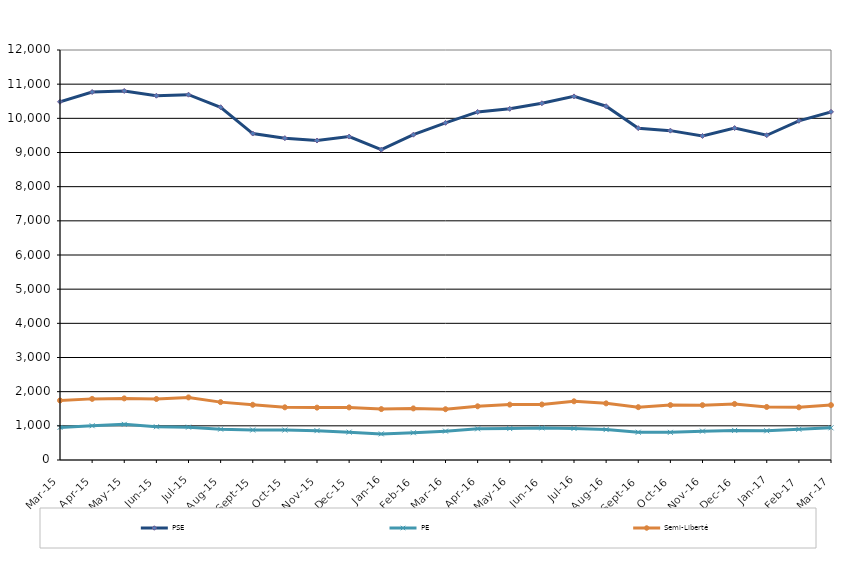
| Category | PSE | PE | Semi-Liberté |
|---|---|---|---|
| 2015-03-01 | 10485 | 954 | 1742 |
| 2015-04-01 | 10770 | 1003 | 1789 |
| 2015-05-01 | 10801 | 1043 | 1803 |
| 2015-06-01 | 10662 | 973 | 1785 |
| 2015-07-01 | 10692 | 961 | 1832 |
| 2015-08-01 | 10325 | 903 | 1694 |
| 2015-09-01 | 9555 | 878 | 1616 |
| 2015-10-01 | 9420 | 877 | 1542 |
| 2015-11-01 | 9350 | 859 | 1533 |
| 2015-12-01 | 9466 | 815 | 1539 |
| 2016-01-01 | 9081 | 764 | 1490 |
| 2016-02-01 | 9521 | 798 | 1510 |
| 2016-03-01 | 9868 | 845 | 1486 |
| 2016-04-01 | 10187 | 912 | 1572 |
| 2016-05-01 | 10278 | 920 | 1621 |
| 2016-06-01 | 10441 | 939 | 1625 |
| 2016-07-01 | 10642 | 923 | 1718 |
| 2016-08-01 | 10355 | 890 | 1658 |
| 2016-09-01 | 9712 | 813 | 1546 |
| 2016-10-01 | 9640 | 809 | 1607 |
| 2016-11-01 | 9484 | 844 | 1605 |
| 2016-12-01 | 9714 | 866 | 1641 |
| 2017-01-01 | 9505 | 855 | 1553 |
| 2017-02-01 | 9927 | 900 | 1542 |
| 2017-03-01 | 10190 | 942 | 1607 |